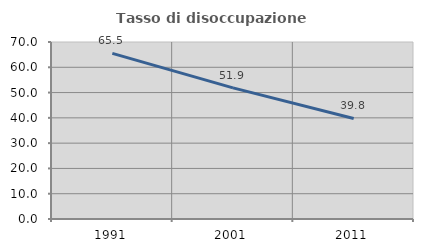
| Category | Tasso di disoccupazione giovanile  |
|---|---|
| 1991.0 | 65.5 |
| 2001.0 | 51.852 |
| 2011.0 | 39.766 |